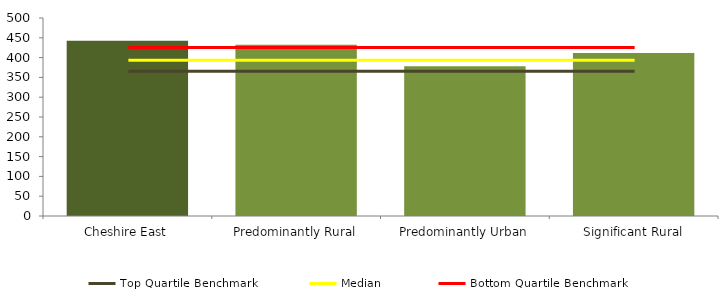
| Category | Series 0 |
|---|---|
| Cheshire East | 442.4 |
| Predominantly Rural | 432.736 |
| Predominantly Urban | 378.125 |
| Significant Rural | 411.56 |